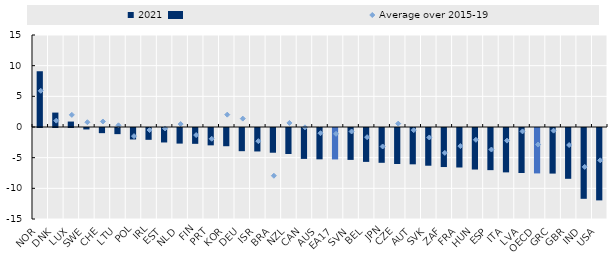
| Category | 2021 |
|---|---|
| NOR | 9.09 |
| DNK | 2.35 |
| LUX | 0.888 |
| SWE | -0.237 |
| CHE | -0.841 |
| LTU | -1.001 |
| POL | -1.869 |
| IRL | -1.928 |
| EST | -2.358 |
| NLD | -2.544 |
| FIN | -2.581 |
| PRT | -2.829 |
| KOR | -2.972 |
| DEU | -3.781 |
| ISR | -3.825 |
| BRA | -4.032 |
| NZL | -4.238 |
| CAN | -5.039 |
| AUS | -5.11 |
| EA17 | -5.126 |
| SVN | -5.2 |
| BEL | -5.525 |
| JPN | -5.674 |
| CZE | -5.874 |
| AUT | -5.923 |
| SVK | -6.15 |
| ZAF | -6.365 |
| FRA | -6.439 |
| HUN | -6.774 |
| ESP | -6.873 |
| ITA | -7.235 |
| LVA | -7.337 |
| OECD | -7.404 |
| GRC | -7.433 |
| GBR | -8.283 |
| IND | -11.544 |
| USA | -11.802 |